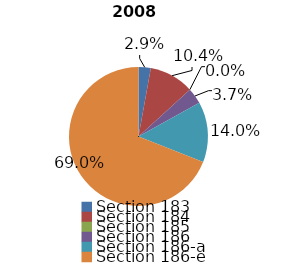
| Category | Series 0 |
|---|---|
| Section 183 | 21318127 |
| Section 184 | 77812568 |
| Section 185 | 23401 |
| Section 186 | 27955323 |
| Section 186-a | 105245100 |
| Section 186-e | 517054802 |